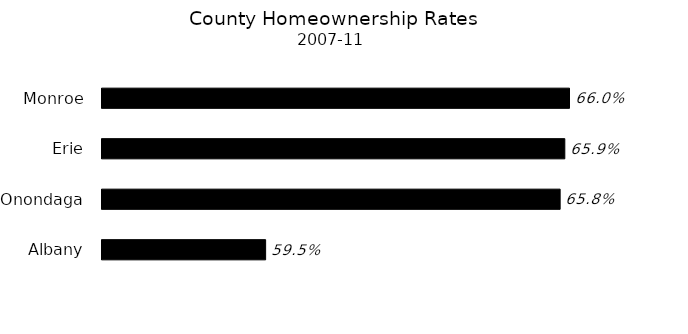
| Category | Series 0 |
|---|---|
| Albany | 0.595 |
| Onondaga | 0.658 |
| Erie | 0.659 |
| Monroe | 0.66 |